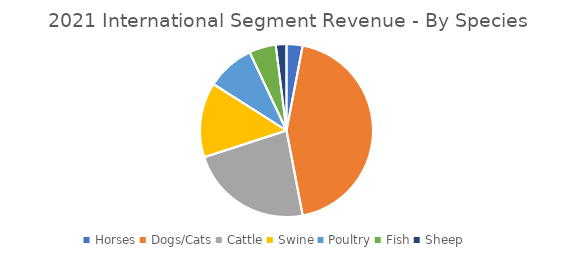
| Category | Series 0 |
|---|---|
| Horses | 0.03 |
| Dogs/Cats | 0.44 |
| Cattle | 0.23 |
| Swine | 0.14 |
| Poultry | 0.09 |
| Fish | 0.05 |
| Sheep | 0.02 |